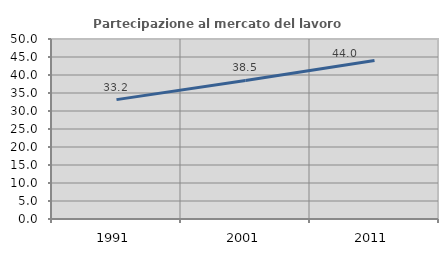
| Category | Partecipazione al mercato del lavoro  femminile |
|---|---|
| 1991.0 | 33.16 |
| 2001.0 | 38.488 |
| 2011.0 | 44.026 |